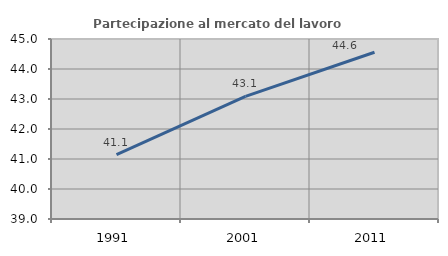
| Category | Partecipazione al mercato del lavoro  femminile |
|---|---|
| 1991.0 | 41.144 |
| 2001.0 | 43.089 |
| 2011.0 | 44.557 |